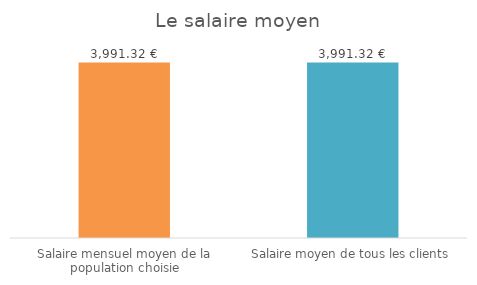
| Category | Series 0 |
|---|---|
| Salaire mensuel moyen de la population choisie | 3991.322 |
| Salaire moyen de tous les clients | 3991.322 |